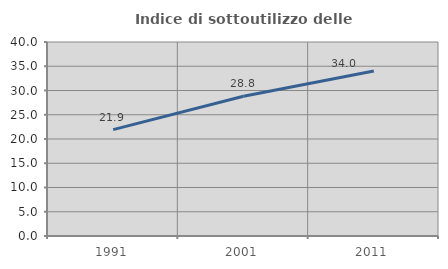
| Category | Indice di sottoutilizzo delle abitazioni  |
|---|---|
| 1991.0 | 21.924 |
| 2001.0 | 28.814 |
| 2011.0 | 34.027 |